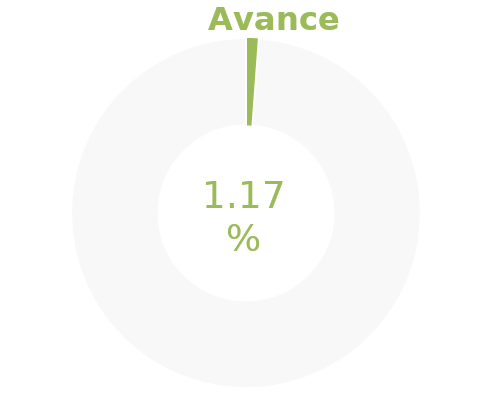
| Category | Series 0 |
|---|---|
| Acumulado 1 Trimestre | 0.012 |
| Año | -0.988 |